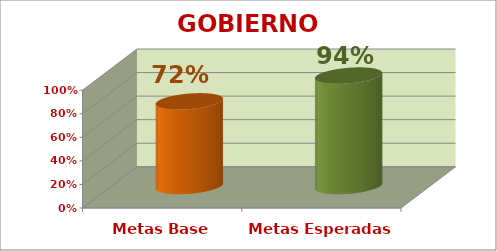
| Category | GOBIERNO ESCOLAR |
|---|---|
| Metas Base | 0.719 |
| Metas Esperadas | 0.938 |